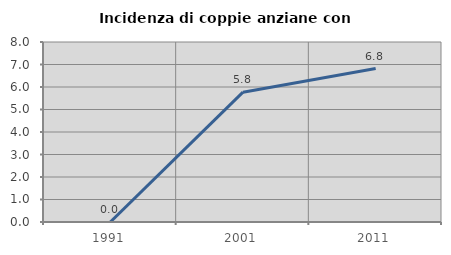
| Category | Incidenza di coppie anziane con figli |
|---|---|
| 1991.0 | 0 |
| 2001.0 | 5.769 |
| 2011.0 | 6.818 |